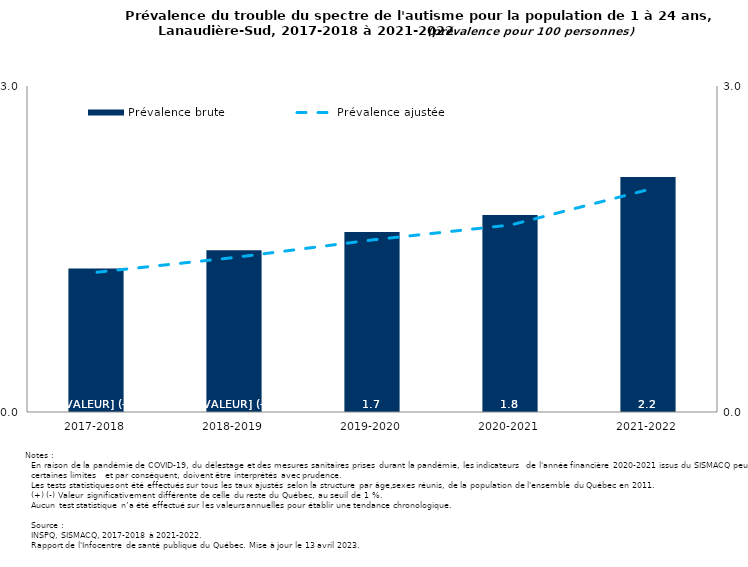
| Category | Prévalence brute |
|---|---|
| 2017-2018 | 1.32 |
| 2018-2019 | 1.489 |
| 2019-2020 | 1.655 |
| 2020-2021 | 1.813 |
| 2021-2022 | 2.162 |